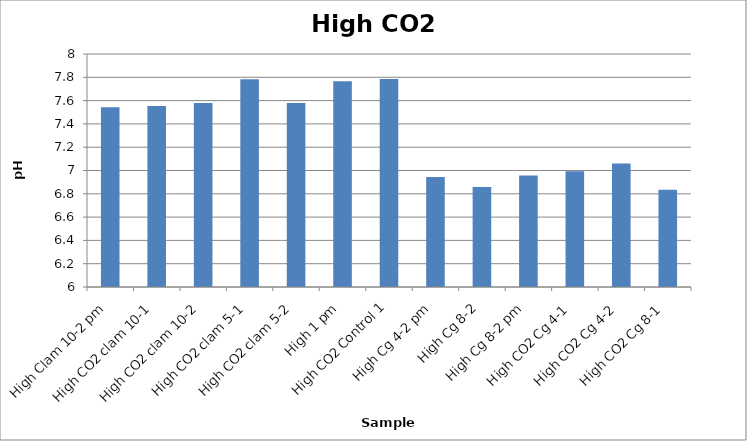
| Category | Series 0 |
|---|---|
| High Clam 10-2 pm | 7.542 |
| High CO2 clam 10-1 | 7.554 |
| High CO2 clam 10-2 | 7.578 |
| High CO2 clam 5-1 | 7.783 |
| High CO2 clam 5-2 | 7.578 |
| High 1 pm | 7.766 |
| High CO2 Control 1 | 7.785 |
| High Cg 4-2 pm | 6.943 |
| High Cg 8-2 | 6.858 |
| High Cg 8-2 pm | 6.956 |
| High CO2 Cg 4-1 | 6.994 |
| High CO2 Cg 4-2 | 7.059 |
| High CO2 Cg 8-1 | 6.835 |